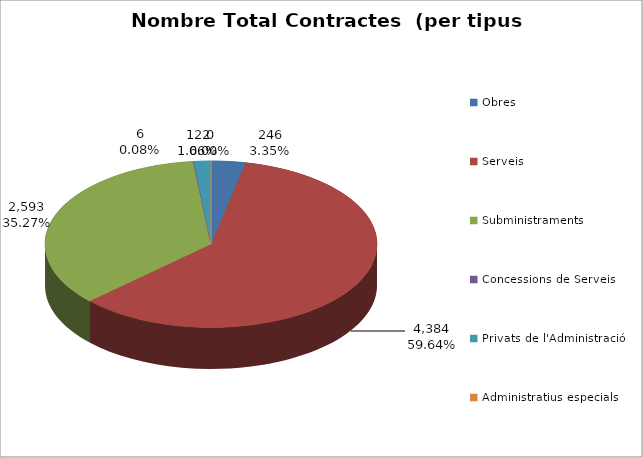
| Category | Nombre Total Contractes |
|---|---|
| Obres | 246 |
| Serveis | 4384 |
| Subministraments | 2593 |
| Concessions de Serveis | 6 |
| Privats de l'Administració | 122 |
| Administratius especials | 0 |